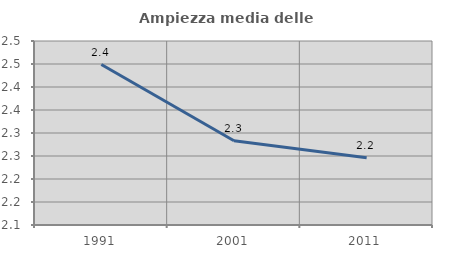
| Category | Ampiezza media delle famiglie |
|---|---|
| 1991.0 | 2.449 |
| 2001.0 | 2.283 |
| 2011.0 | 2.246 |